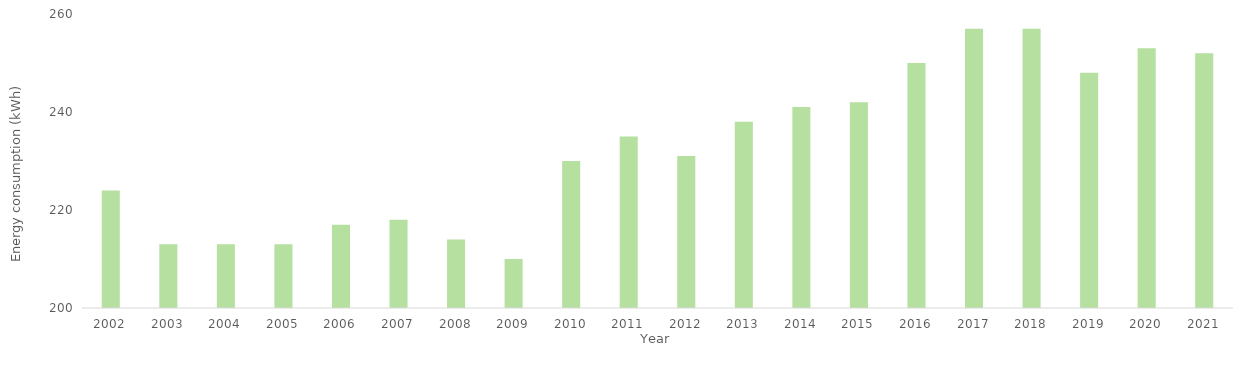
| Category | Series 0 |
|---|---|
| 2002.0 | 224 |
| 2003.0 | 213 |
| 2004.0 | 213 |
| 2005.0 | 213 |
| 2006.0 | 217 |
| 2007.0 | 218 |
| 2008.0 | 214 |
| 2009.0 | 210 |
| 2010.0 | 230 |
| 2011.0 | 235 |
| 2012.0 | 231 |
| 2013.0 | 238 |
| 2014.0 | 241 |
| 2015.0 | 242 |
| 2016.0 | 250 |
| 2017.0 | 257 |
| 2018.0 | 257 |
| 2019.0 | 248 |
| 2020.0 | 253 |
| 2021.0 | 252 |